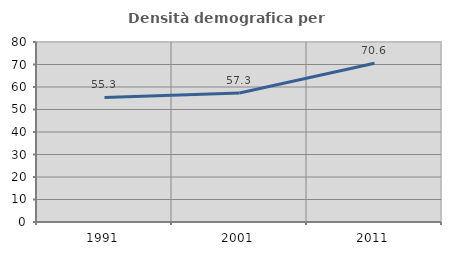
| Category | Densità demografica |
|---|---|
| 1991.0 | 55.333 |
| 2001.0 | 57.325 |
| 2011.0 | 70.554 |